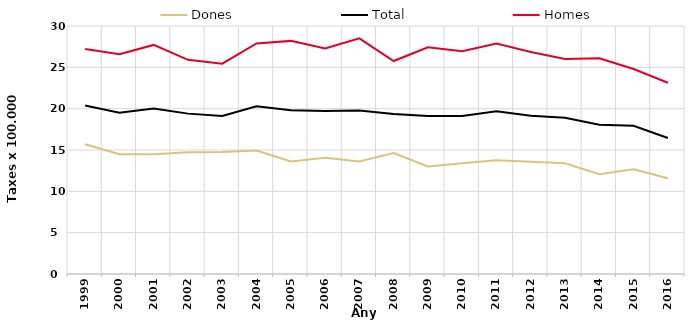
| Category | Dones | Total | Homes |
|---|---|---|---|
| 1999.0 | 15.69 | 20.39 | 27.21 |
| 2000.0 | 14.5 | 19.52 | 26.59 |
| 2001.0 | 14.48 | 20.02 | 27.71 |
| 2002.0 | 14.73 | 19.4 | 25.91 |
| 2003.0 | 14.77 | 19.11 | 25.44 |
| 2004.0 | 14.94 | 20.29 | 27.89 |
| 2005.0 | 13.61 | 19.81 | 28.2 |
| 2006.0 | 14.05 | 19.71 | 27.28 |
| 2007.0 | 13.62 | 19.77 | 28.5 |
| 2008.0 | 14.64 | 19.35 | 25.76 |
| 2009.0 | 13.01 | 19.1 | 27.42 |
| 2010.0 | 13.39 | 19.12 | 26.96 |
| 2011.0 | 13.75 | 19.69 | 27.88 |
| 2012.0 | 13.57 | 19.13 | 26.85 |
| 2013.0 | 13.39 | 18.9 | 26.01 |
| 2014.0 | 12.06 | 18.06 | 26.09 |
| 2015.0 | 12.67 | 17.94 | 24.8 |
| 2016.0 | 11.58 | 16.45 | 23.13 |